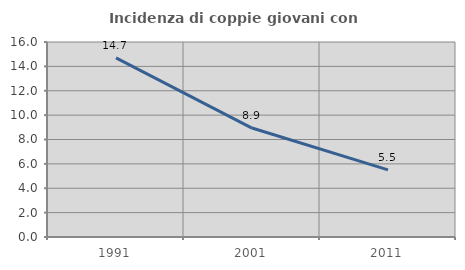
| Category | Incidenza di coppie giovani con figli |
|---|---|
| 1991.0 | 14.7 |
| 2001.0 | 8.94 |
| 2011.0 | 5.508 |